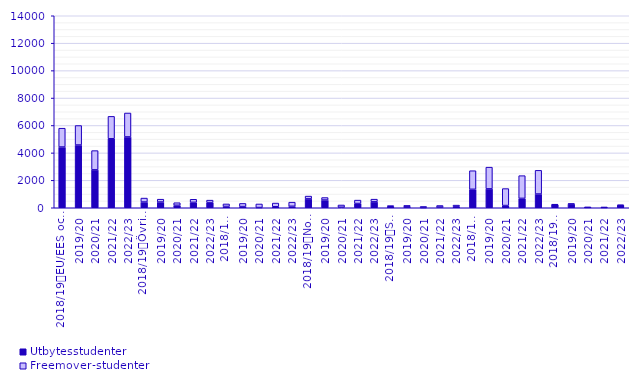
| Category | Utbytesstudenter | Freemover-studenter |
|---|---|---|
| 0 | 4428 | 1373 |
| 1 | 4575 | 1422 |
| 2 | 2762 | 1405 |
| 3 | 5029 | 1635 |
| 4 | 5164 | 1745 |
| 5 | 416 | 290 |
| 6 | 417 | 208 |
| 7 | 180 | 188 |
| 8 | 393 | 225 |
| 9 | 375 | 180 |
| 10 | 95 | 183 |
| 11 | 85 | 231 |
| 12 | 15 | 261 |
| 13 | 74 | 268 |
| 14 | 107 | 301 |
| 15 | 647 | 203 |
| 16 | 561 | 183 |
| 17 | 36 | 166 |
| 18 | 307 | 251 |
| 19 | 429 | 198 |
| 20 | 72 | 87 |
| 21 | 65 | 106 |
| 22 | 14 | 78 |
| 23 | 50 | 113 |
| 24 | 83 | 110 |
| 25 | 1345 | 1356 |
| 26 | 1377 | 1584 |
| 27 | 161 | 1238 |
| 28 | 683 | 1658 |
| 29 | 1001 | 1728 |
| 30 | 224 | 16 |
| 31 | 272 | 15 |
| 32 | 28 | 7 |
| 33 | 21 | 16 |
| 34 | 183 | 11 |